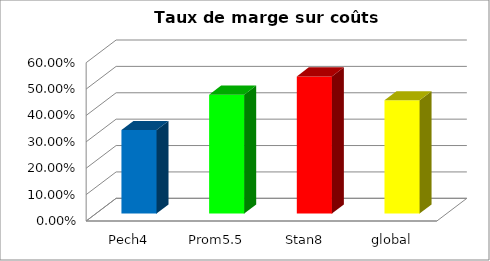
| Category | Series 0 |
|---|---|
| Pech4 | 0.316 |
| Prom5.5 | 0.451 |
| Stan8 | 0.52 |
| global | 0.429 |